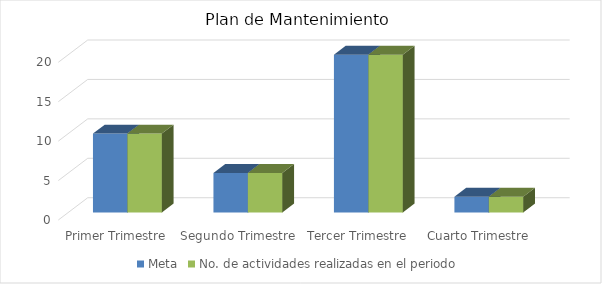
| Category | Meta | No. de actividades realizadas en el periodo |
|---|---|---|
| Primer Trimestre | 10 | 10 |
| Segundo Trimestre | 5 | 5 |
| Tercer Trimestre | 20 | 20 |
| Cuarto Trimestre | 2 | 2 |